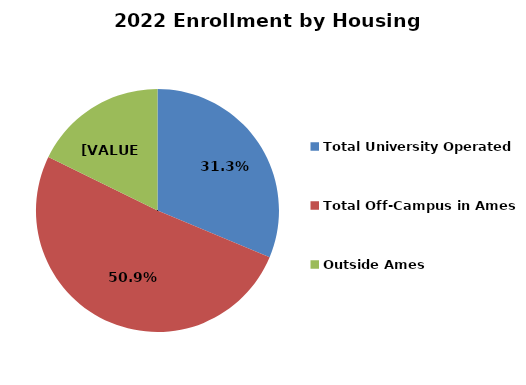
| Category | Series 0 |
|---|---|
| Total University Operated | 0.313 |
| Total Off-Campus in Ames | 0.509 |
| Outside Ames | 0.178 |